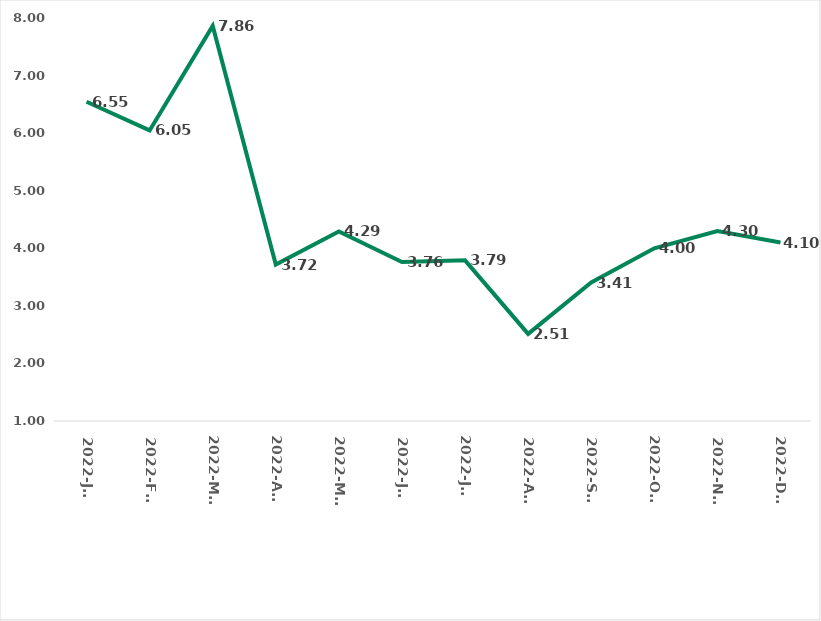
| Category |  Average Length of Stay, days |
|---|---|
| 2022-Jan | 6.545 |
| 2022-Feb | 6.047 |
| 2022-Mar | 7.863 |
| 2022-Apr | 3.718 |
| 2022-May | 4.294 |
| 2022-Jun | 3.76 |
| 2022-Jul | 3.791 |
| 2022-Aug | 2.513 |
| 2022-Sep | 3.405 |
| 2022-Oct | 4 |
| 2022-Nov | 4.3 |
| 2022-Dec | 4.1 |